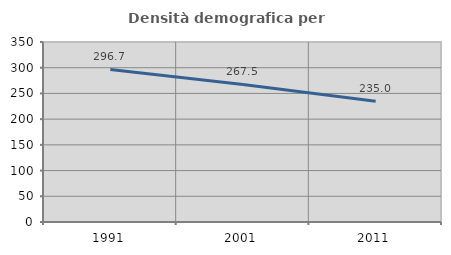
| Category | Densità demografica |
|---|---|
| 1991.0 | 296.715 |
| 2001.0 | 267.494 |
| 2011.0 | 234.977 |